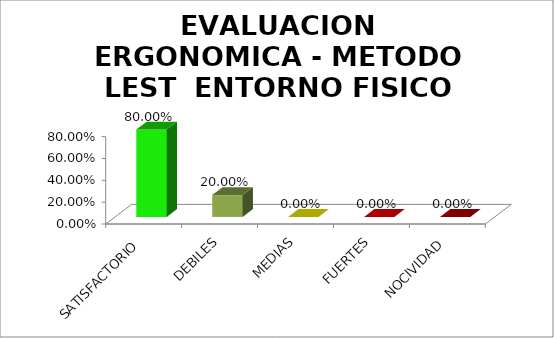
| Category | EVALUACION ERGONOMICA - METODO LEST  |
|---|---|
| SATISFACTORIO | 0.8 |
| DEBILES | 0.2 |
| MEDIAS | 0 |
| FUERTES | 0 |
| NOCIVIDAD | 0 |